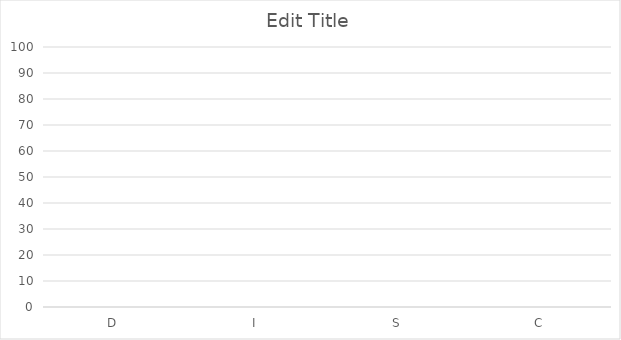
| Category | Series 0 |
|---|---|
| D | 0 |
| I | 0 |
| S | 0 |
| C | 0 |